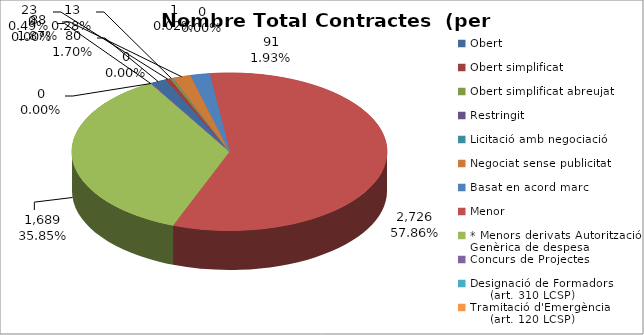
| Category | Nombre Total Contractes |
|---|---|
| Obert | 80 |
| Obert simplificat | 23 |
| Obert simplificat abreujat | 13 |
| Restringit | 0 |
| Licitació amb negociació | 1 |
| Negociat sense publicitat | 88 |
| Basat en acord marc | 91 |
| Menor | 2726 |
| * Menors derivats Autorització Genèrica de despesa | 1689 |
| Concurs de Projectes | 0 |
| Designació de Formadors
     (art. 310 LCSP) | 0 |
| Tramitació d'Emergència
     (art. 120 LCSP) | 0 |